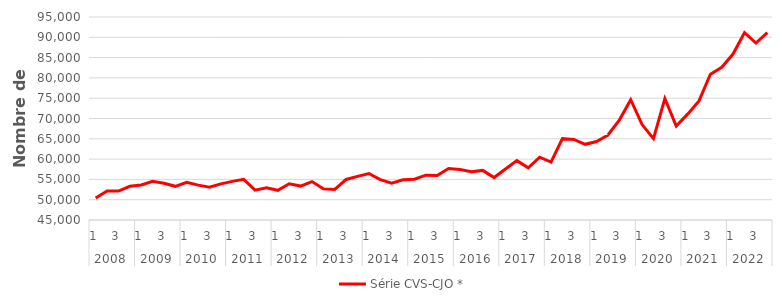
| Category | Série CVS-CJO * |
|---|---|
| 0 | 50411.259 |
| 1 | 52161.279 |
| 2 | 52119.924 |
| 3 | 53292.595 |
| 4 | 53627.283 |
| 5 | 54519.552 |
| 6 | 54033.419 |
| 7 | 53297.035 |
| 8 | 54257.247 |
| 9 | 53589.635 |
| 10 | 53057.056 |
| 11 | 53904.385 |
| 12 | 54516.193 |
| 13 | 55007.5 |
| 14 | 52358.33 |
| 15 | 52924.293 |
| 16 | 52306.565 |
| 17 | 53916.725 |
| 18 | 53356.632 |
| 19 | 54460.001 |
| 20 | 52663.817 |
| 21 | 52538.302 |
| 22 | 54985.047 |
| 23 | 55732.9 |
| 24 | 56444.919 |
| 25 | 54960.042 |
| 26 | 54088.848 |
| 27 | 54903.763 |
| 28 | 55043.55 |
| 29 | 56042.655 |
| 30 | 55961.593 |
| 31 | 57693.041 |
| 32 | 57411.297 |
| 33 | 56898.198 |
| 34 | 57212.98 |
| 35 | 55450.908 |
| 36 | 57562.651 |
| 37 | 59627.957 |
| 38 | 57845.581 |
| 39 | 60460.064 |
| 40 | 59262.502 |
| 41 | 65030.322 |
| 42 | 64829.507 |
| 43 | 63641.677 |
| 44 | 64335.288 |
| 45 | 65934.485 |
| 46 | 69610.635 |
| 47 | 74630.843 |
| 48 | 68504.93 |
| 49 | 65042.585 |
| 50 | 74920.282 |
| 51 | 68158.965 |
| 52 | 71070.369 |
| 53 | 74340.492 |
| 54 | 80905.455 |
| 55 | 82602.508 |
| 56 | 85931.449 |
| 57 | 91157.19 |
| 58 | 88599.391 |
| 59 | 91163.732 |